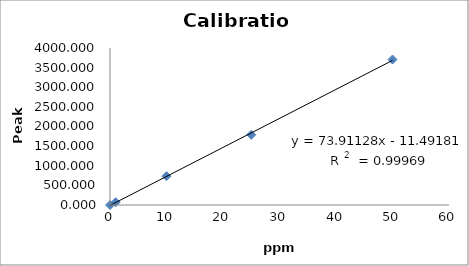
| Category | Series 0 |
|---|---|
| 0.0 | 0 |
| 1.0 | 70.152 |
| 10.0 | 733.224 |
| 25.0 | 1789.187 |
| 50.0 | 3706.349 |